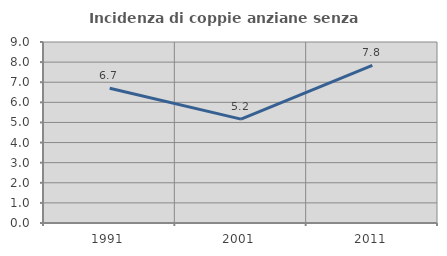
| Category | Incidenza di coppie anziane senza figli  |
|---|---|
| 1991.0 | 6.704 |
| 2001.0 | 5.164 |
| 2011.0 | 7.835 |